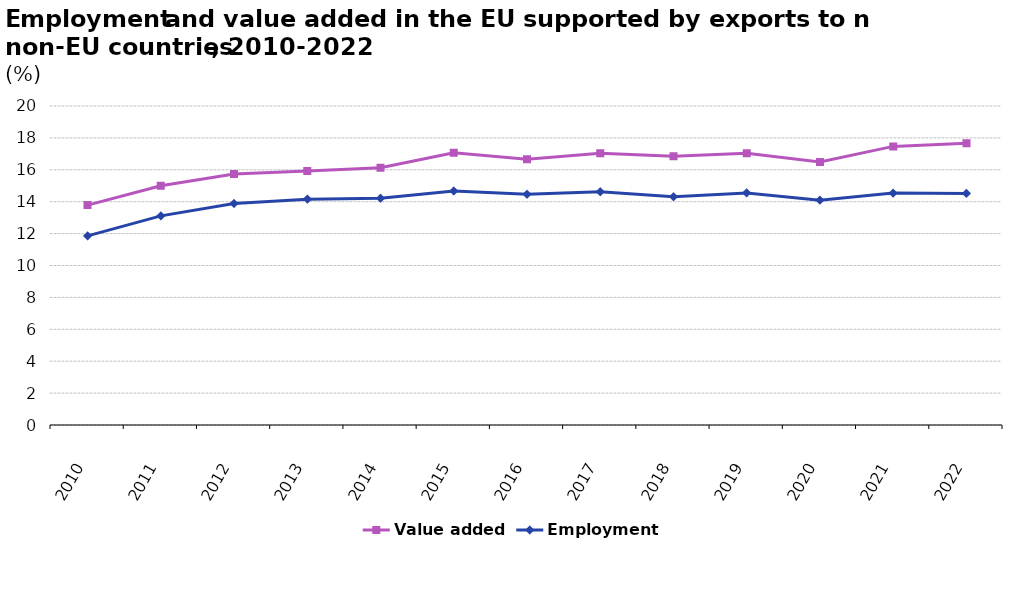
| Category | Value added | Employment |
|---|---|---|
| 2010.0 | 13.786 | 11.854 |
| 2011.0 | 14.997 | 13.112 |
| 2012.0 | 15.733 | 13.885 |
| 2013.0 | 15.924 | 14.16 |
| 2014.0 | 16.132 | 14.219 |
| 2015.0 | 17.068 | 14.674 |
| 2016.0 | 16.664 | 14.464 |
| 2017.0 | 17.031 | 14.62 |
| 2018.0 | 16.844 | 14.308 |
| 2019.0 | 17.041 | 14.552 |
| 2020.0 | 16.49 | 14.095 |
| 2021.0 | 17.467 | 14.539 |
| 2022.0 | 17.657 | 14.522 |